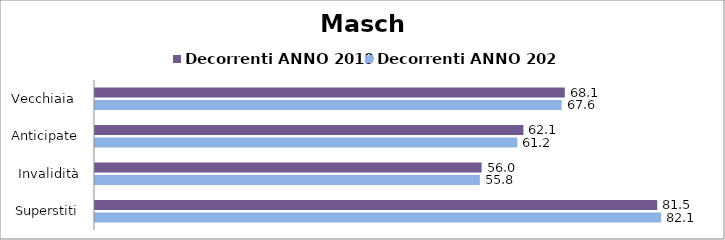
| Category | Decorrenti ANNO 2019 | Decorrenti ANNO 2020 |
|---|---|---|
| Vecchiaia  | 68.09 | 67.64 |
| Anticipate | 62.09 | 61.21 |
| Invalidità | 56.03 | 55.78 |
| Superstiti | 81.48 | 82.05 |